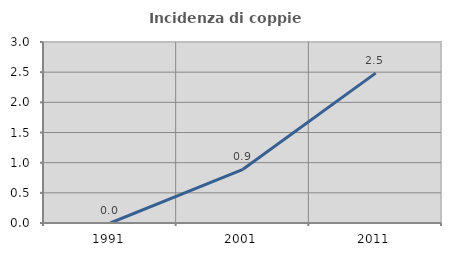
| Category | Incidenza di coppie miste |
|---|---|
| 1991.0 | 0 |
| 2001.0 | 0.89 |
| 2011.0 | 2.484 |